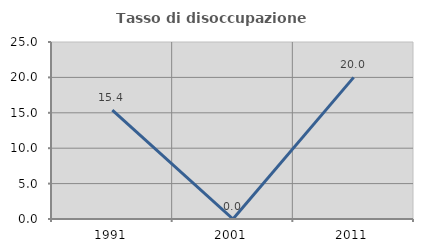
| Category | Tasso di disoccupazione giovanile  |
|---|---|
| 1991.0 | 15.385 |
| 2001.0 | 0 |
| 2011.0 | 20 |